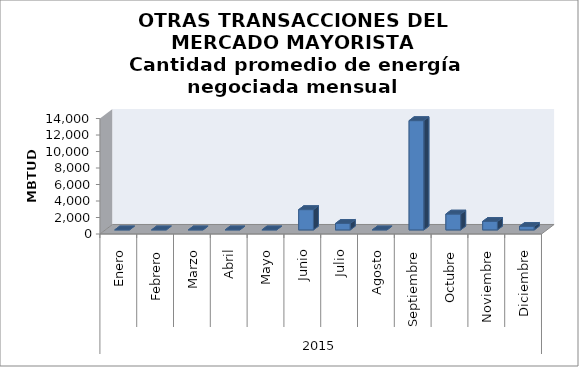
| Category | Cantidad Promedio
(MBTUD) |
|---|---|
| 0 | 0 |
| 1 | 0 |
| 2 | 0 |
| 3 | 0 |
| 4 | 0 |
| 5 | 2460 |
| 6 | 784.75 |
| 7 | 0 |
| 8 | 13250 |
| 9 | 1922.29 |
| 10 | 1028.97 |
| 11 | 424.5 |